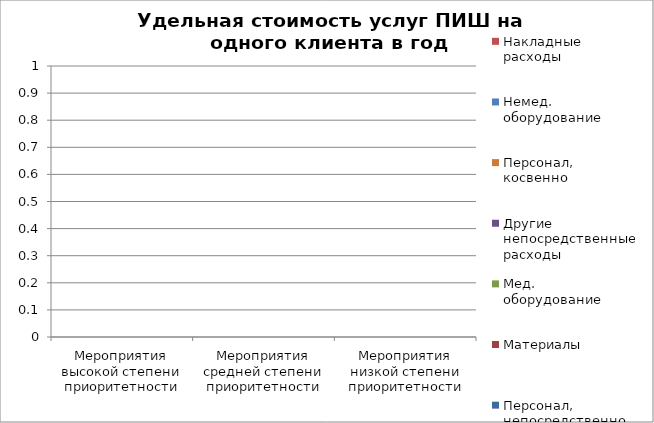
| Category | Персонал, непосредственно оказывающий услуги | Материалы | Мед. оборудование | Другие непосредственные расходы | Персонал, косвенно участвующий в оказании услуг | Немед. оборудование | Накладные расходы | Персонал, непосредственно | Персонал, косвенно |
|---|---|---|---|---|---|---|---|---|---|
| Мероприятия высокой степени приоритетности | 0 |  |  |  | 0 |  |  |  |  |
| Мероприятия средней степени приоритетности | 0 |  |  |  | 0 |  |  |  |  |
| Мероприятия низкой степени приоритетности | 0 |  |  |  | 0 |  |  |  |  |